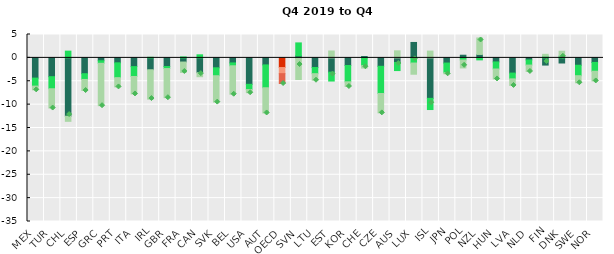
| Category | Joblessness (net of population change) | Hours per at work employees | 0 hours employment |
|---|---|---|---|
| MEX | -4.327 | -1.716 | -0.796 |
| TUR | -4.023 | -2.579 | -4.129 |
| CHL | -12.474 | 1.443 | -1.098 |
| ESP | -3.383 | -1.233 | -2.367 |
| GRC | -0.615 | -0.543 | -9.068 |
| PRT | -1.057 | -3.173 | -1.981 |
| ITA | -1.869 | -2.118 | -3.725 |
| IRL | -2.542 | 0.131 | -6.289 |
| GBR | -1.85 | -0.434 | -6.232 |
| FRA | -0.888 | 0.204 | -2.227 |
| CAN | -3.172 | 0.656 | -0.856 |
| SVK | -2.124 | -1.696 | -5.646 |
| BEL | -1.077 | -0.616 | -6.081 |
| USA | -5.657 | -1.115 | -0.675 |
| AUT | -1.502 | -4.889 | -5.396 |
| OECD | -2.068 | -1.309 | -2.108 |
| SVN | 0.419 | 2.784 | -4.629 |
| LTU | -2.063 | -1.317 | -1.404 |
| EST | -3.058 | -1.898 | 1.471 |
| KOR | -1.628 | -3.489 | -1.004 |
| CHE | 0.284 | -1.67 | -0.509 |
| CZE | -1.802 | -5.82 | -4.141 |
| AUS | -0.983 | -1.733 | 1.508 |
| LUX | 3.297 | -1.104 | -2.398 |
| ISL | -8.658 | -2.392 | 1.451 |
| JPN | -1.107 | -2.077 | -0.227 |
| POL | 0.568 | -0.458 | -1.698 |
| NZL | 0.732 | -0.427 | 3.525 |
| HUN | -0.868 | -1.512 | -2.123 |
| LVA | -3.252 | -1.237 | -1.407 |
| NLD | -0.446 | -1.091 | -1.369 |
| FIN | -1.54 | 0.349 | 0.411 |
| DNK | -1.096 | 0.383 | 1.037 |
| SWE | -1.577 | -2.238 | -1.516 |
| NOR | -0.976 | -1.884 | -2.077 |